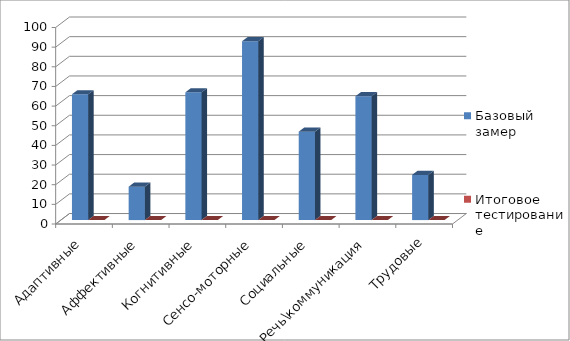
| Category | Базовый замер | Итоговое тестирование |
|---|---|---|
| Адаптивные | 64 | 0 |
| Аффективные | 17 | 0 |
| Когнитивные | 65 | 0 |
| Сенсо-моторные | 91 | 0 |
| Социальные | 45 | 0 |
| Речь\коммуникация | 63 | 0 |
| Трудовые | 23 | 0 |